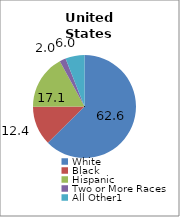
| Category | 50 states and D.C.2 |
|---|---|
| White | 62.581 |
| Black | 12.361 |
| Hispanic | 17.104 |
| Two or More Races | 1.958 |
| All Other1 | 5.996 |